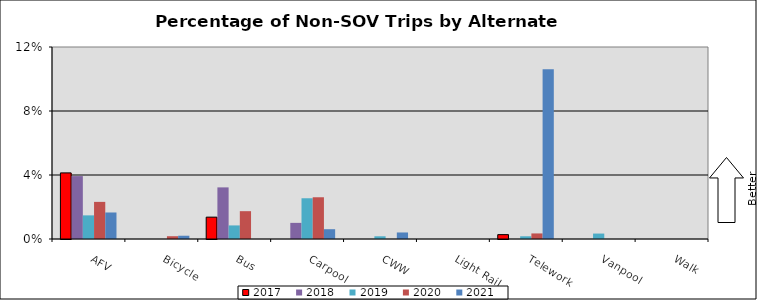
| Category | 2017 | 2018 | 2019 | 2020 | 2021 |
|---|---|---|---|---|---|
| AFV | 0.041 | 0.039 | 0.015 | 0.023 | 0.017 |
| Bicycle | 0 | 0 | 0 | 0.002 | 0.002 |
| Bus | 0.014 | 0.032 | 0.008 | 0.017 | 0 |
| Carpool | 0 | 0.01 | 0.025 | 0.026 | 0.006 |
| CWW | 0 | 0 | 0.002 | 0 | 0.004 |
| Light Rail | 0 | 0 | 0 | 0 | 0 |
| Telework | 0.003 | 0 | 0.002 | 0.003 | 0.106 |
| Vanpool | 0 | 0 | 0.003 | 0 | 0 |
| Walk | 0 | 0 | 0 | 0 | 0 |